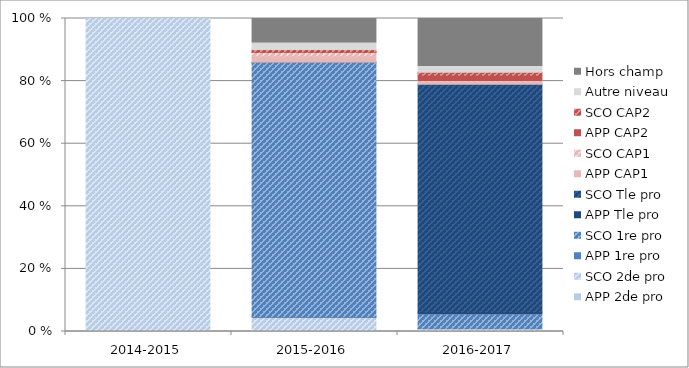
| Category | APP 2de pro | SCO 2de pro | APP 1re pro | SCO 1re pro | APP Tle pro | SCO Tle pro | APP CAP1 | SCO CAP1 | APP CAP2 | SCO CAP2 | Autre niveau | Hors champ |
|---|---|---|---|---|---|---|---|---|---|---|---|---|
| 2014-2015 | 0 | 100 | 0 | 0 | 0 | 0 | 0 | 0 | 0 | 0 | 0 | 0 |
| 2015-2016 | 0.26 | 3.93 | 0.56 | 81.22 | 0.01 | 0.03 | 2.07 | 1.03 | 0.17 | 0.81 | 2.41 | 7.51 |
| 2016-2017 | 0.11 | 0.45 | 0.45 | 4.26 | 0.96 | 72.8 | 0.97 | 0.23 | 1.6 | 0.99 | 2.13 | 15.05 |